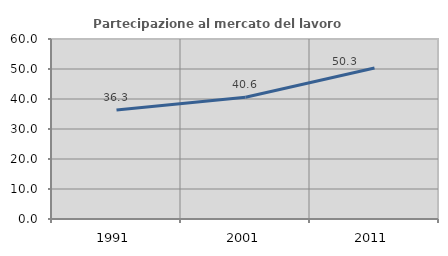
| Category | Partecipazione al mercato del lavoro  femminile |
|---|---|
| 1991.0 | 36.309 |
| 2001.0 | 40.603 |
| 2011.0 | 50.322 |